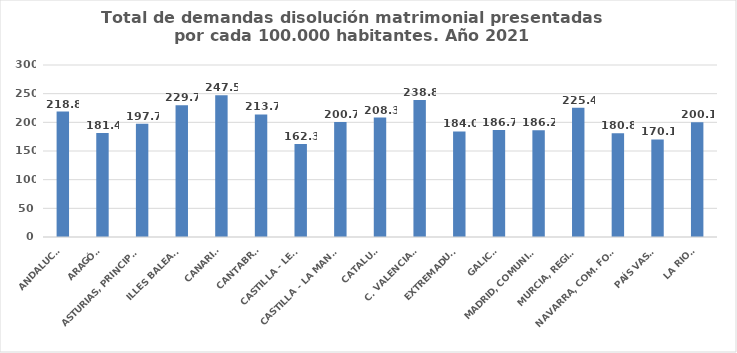
| Category | Series 0 |
|---|---|
| ANDALUCÍA | 218.845 |
| ARAGÓN | 181.412 |
| ASTURIAS, PRINCIPADO | 197.669 |
| ILLES BALEARS | 229.666 |
| CANARIAS | 247.452 |
| CANTABRIA | 213.684 |
| CASTILLA - LEÓN | 162.349 |
| CASTILLA - LA MANCHA | 200.726 |
| CATALUÑA | 208.299 |
| C. VALENCIANA | 238.803 |
| EXTREMADURA | 184.049 |
| GALICIA | 186.746 |
| MADRID, COMUNIDAD | 186.158 |
| MURCIA, REGIÓN | 225.356 |
| NAVARRA, COM. FORAL | 180.791 |
| PAÍS VASCO | 170.145 |
| LA RIOJA | 200.128 |